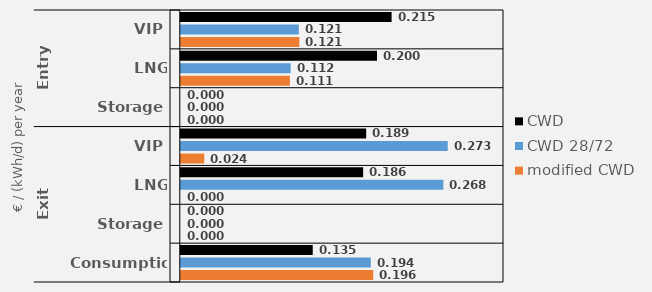
| Category | CWD | CWD 28/72 | modified CWD |
|---|---|---|---|
| 0 | 0.215 | 0.121 | 0.121 |
| 1 | 0.2 | 0.112 | 0.111 |
| 2 | 0 | 0 | 0 |
| 3 | 0.189 | 0.273 | 0.024 |
| 4 | 0.186 | 0.268 | 0 |
| 5 | 0 | 0 | 0 |
| 6 | 0.135 | 0.194 | 0.196 |